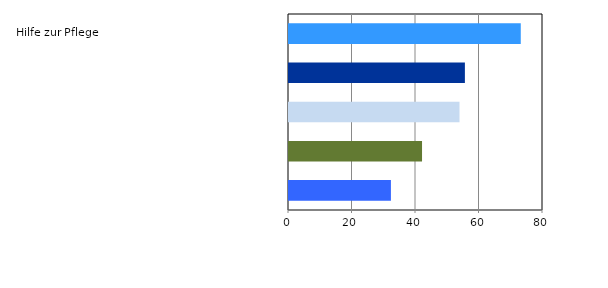
| Category | Series 0 |
|---|---|
| Eingliederungshilfe | 32.1 |
| Leistungen insgesamt | 41.9 |
| Hilfe z.Überw. Bes.Schwierigk. | 53.7 |
| Hilfe z. Gesundheit | 55.4 |
| Hilfe zur Pflege | 73 |